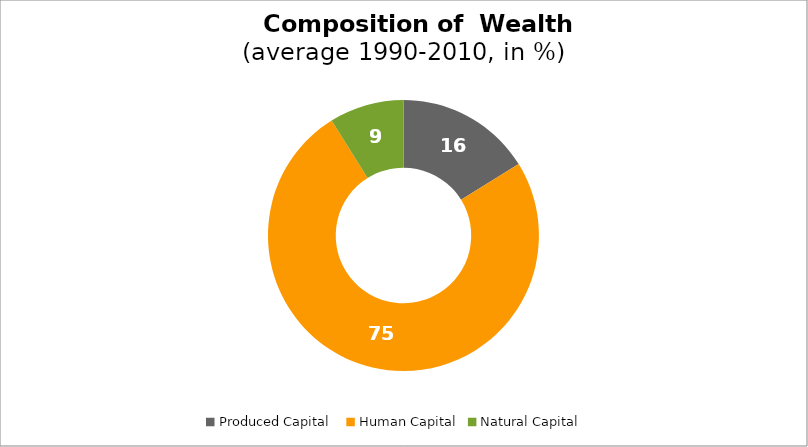
| Category | Series 0 |
|---|---|
| Produced Capital  | 16.168 |
| Human Capital | 74.937 |
| Natural Capital | 8.895 |